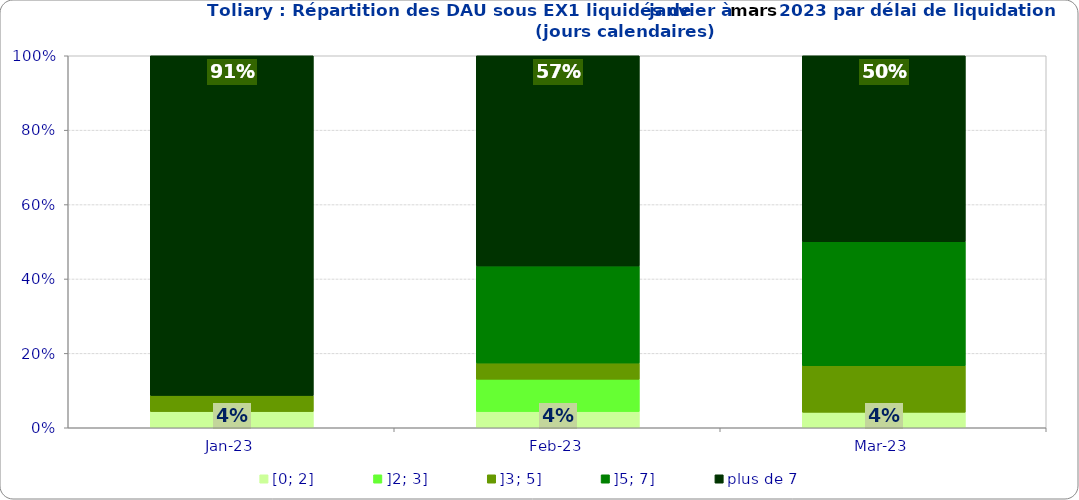
| Category | [0; 2] | ]2; 3] | ]3; 5] | ]5; 7] | plus de 7 |
|---|---|---|---|---|---|
| 2023-01-01 | 0.043 | 0 | 0.043 | 0 | 0.913 |
| 2023-02-01 | 0.043 | 0.087 | 0.043 | 0.261 | 0.565 |
| 2023-03-01 | 0.042 | 0 | 0.125 | 0.333 | 0.5 |